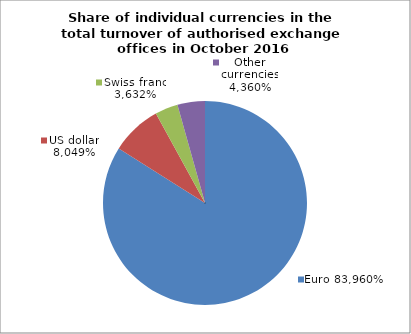
| Category | EUR |
|---|---|
| 0.716079492598274 | 0.84 |
| 0.2839199572999224 | 0.08 |
| 5.501018035729667e-07 | 0.036 |